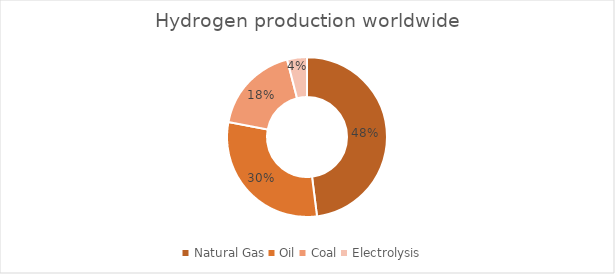
| Category | Series 0 |
|---|---|
| Natural Gas | 0.48 |
| Oil | 0.3 |
| Coal | 0.18 |
| Electrolysis | 0.04 |